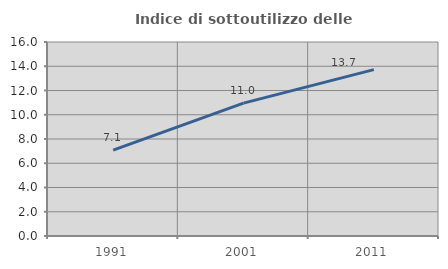
| Category | Indice di sottoutilizzo delle abitazioni  |
|---|---|
| 1991.0 | 7.083 |
| 2001.0 | 10.962 |
| 2011.0 | 13.725 |